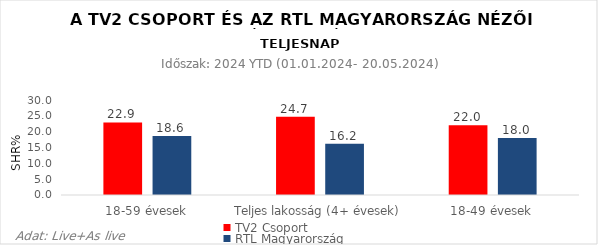
| Category | TV2 Csoport | RTL Magyarország |
|---|---|---|
| 18-59 évesek | 22.9 | 18.6 |
| Teljes lakosság (4+ évesek) | 24.7 | 16.2 |
| 18-49 évesek | 22 | 18 |